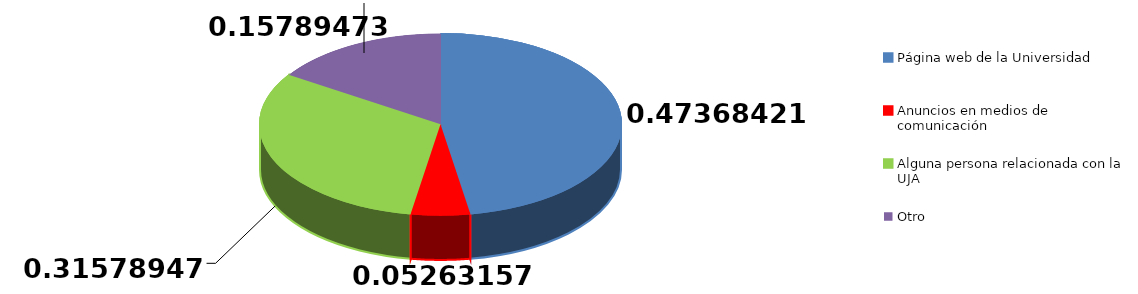
| Category | Frecuencia | Series 1 |
|---|---|---|
| Página web de la Universidad | 9 |  |
| Anuncios en medios de comunicación | 1 |  |
| Alguna persona relacionada con la UJA | 6 |  |
| Otro | 3 |  |